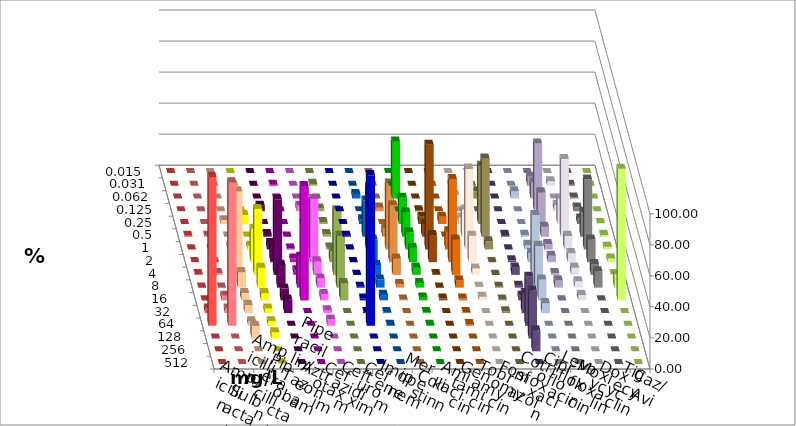
| Category | Ampicillin | Ampicillin/ Sulbactam | Piperacillin | Piperacillin/ Tazobactam | Aztreonam | Cefotaxim | Ceftazidim | Cefuroxim | Imipenem | Meropenem | Colistin | Amikacin | Gentamicin | Tobramycin | Fosfomycin | Cotrimoxazol | Ciprofloxacin | Levofloxacin | Moxifloxacin | Doxycyclin | Tigecyclin | Caz/Avi |
|---|---|---|---|---|---|---|---|---|---|---|---|---|---|---|---|---|---|---|---|---|---|---|
| 0.015 | 0 | 0 | 0 | 0 | 0 | 0 | 0 | 0 | 0 | 0 | 0 | 0 | 0 | 0 | 0 | 0 | 0 | 0 | 0 | 0 | 0 | 0 |
| 0.031 | 0 | 0 | 0 | 0 | 0 | 0.585 | 0 | 0 | 0 | 0 | 0 | 0 | 0 | 0 | 0 | 0 | 5.814 | 2.907 | 0.585 | 0 | 1.17 | 0 |
| 0.062 | 0 | 0 | 0 | 0 | 0 | 0 | 0 | 0 | 2.907 | 36.628 | 0 | 0 | 2.339 | 4.678 | 0 | 4.678 | 10.465 | 0 | 0.585 | 0 | 0 | 0 |
| 0.125 | 0 | 0 | 0 | 0 | 3.509 | 0 | 3.488 | 0 | 0 | 0 | 0.581 | 0 | 0 | 0 | 0 | 0 | 43.605 | 4.07 | 2.339 | 0 | 1.754 | 2.326 |
| 0.25 | 0 | 0 | 2.339 | 5.814 | 0 | 0 | 0 | 0 | 2.907 | 16.86 | 4.651 | 4.651 | 4.094 | 37.427 | 0 | 0 | 20.349 | 16.279 | 3.509 | 0.585 | 1.17 | 0 |
| 0.5 | 0.585 | 0.585 | 0 | 0 | 1.754 | 0 | 2.326 | 0.585 | 23.256 | 15.698 | 8.14 | 0 | 17.544 | 50.292 | 1.17 | 1.17 | 6.395 | 50 | 15.789 | 1.17 | 1.754 | 5.233 |
| 1.0 | 0 | 0 | 2.339 | 2.326 | 4.094 | 0.585 | 29.07 | 0 | 40.116 | 11.047 | 67.442 | 11.628 | 52.047 | 5.263 | 0 | 2.924 | 3.488 | 8.721 | 45.029 | 1.754 | 1.17 | 42.442 |
| 2.0 | 0 | 0 | 10.526 | 21.512 | 11.111 | 2.339 | 40.698 | 0 | 14.535 | 9.302 | 17.442 | 53.488 | 16.959 | 0 | 1.17 | 5.848 | 4.07 | 5.814 | 14.62 | 2.339 | 7.018 | 36.628 |
| 4.0 | 0.585 | 1.17 | 53.801 | 42.442 | 48.538 | 2.924 | 8.721 | 0 | 6.395 | 4.651 | 0.581 | 22.674 | 4.094 | 0 | 4.678 | 38.596 | 1.163 | 4.651 | 7.018 | 0.585 | 41.52 | 10.465 |
| 8.0 | 0 | 0 | 9.942 | 12.791 | 14.62 | 19.883 | 5.814 | 0.585 | 5.233 | 2.907 | 0 | 4.651 | 0.585 | 0.585 | 1.17 | 26.901 | 4.651 | 4.07 | 10.526 | 8.772 | 33.333 | 2.326 |
| 16.0 | 0 | 2.924 | 4.678 | 4.651 | 7.602 | 73.684 | 4.07 | 1.17 | 3.488 | 1.744 | 1.163 | 1.163 | 2.339 | 0.585 | 2.924 | 13.45 | 0 | 3.488 | 0 | 84.795 | 11.111 | 0.581 |
| 32.0 | 2.924 | 2.924 | 5.263 | 2.907 | 8.772 | 0 | 1.744 | 0.585 | 0.581 | 0.581 | 0 | 0.581 | 0 | 1.17 | 12.865 | 6.433 | 0 | 0 | 0 | 0 | 0 | 0 |
| 64.0 | 95.906 | 92.398 | 2.924 | 2.907 | 0 | 0 | 4.07 | 97.076 | 0.581 | 0.581 | 0 | 1.163 | 0 | 0 | 31.579 | 0 | 0 | 0 | 0 | 0 | 0 | 0 |
| 128.0 | 0 | 0 | 8.187 | 4.07 | 0 | 0 | 0 | 0 | 0 | 0 | 0 | 0 | 0 | 0 | 30.994 | 0 | 0 | 0 | 0 | 0 | 0 | 0 |
| 256.0 | 0 | 0 | 0 | 0 | 0 | 0 | 0 | 0 | 0 | 0 | 0 | 0 | 0 | 0 | 13.45 | 0 | 0 | 0 | 0 | 0 | 0 | 0 |
| 512.0 | 0 | 0 | 0 | 0.581 | 0 | 0 | 0 | 0 | 0 | 0 | 0 | 0 | 0 | 0 | 0 | 0 | 0 | 0 | 0 | 0 | 0 | 0 |